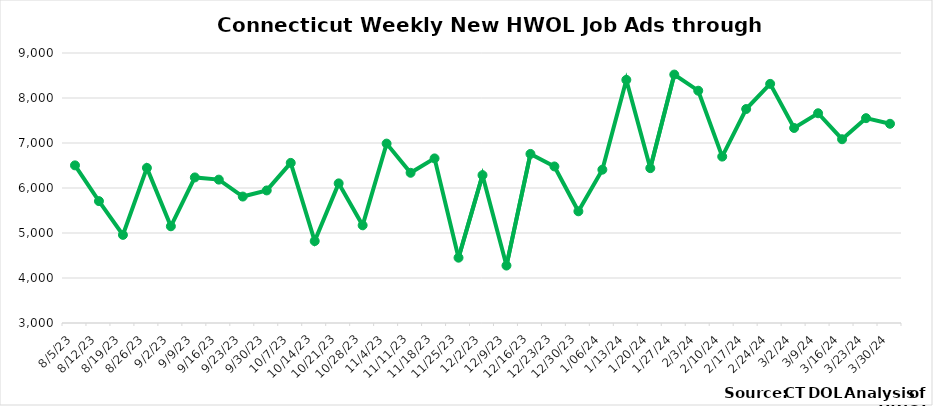
| Category | Connecticut |
|---|---|
| 8/5/23 | 6503 |
| 8/12/23 | 5708 |
| 8/19/23 | 4958 |
| 8/26/23 | 6447 |
| 9/2/23 | 5149 |
| 9/9/23 | 6235 |
| 9/16/23 | 6186 |
| 9/23/23 | 5810 |
| 9/30/23 | 5946 |
| 10/7/23 | 6558 |
| 10/14/23 | 4820 |
| 10/21/23 | 6103 |
| 10/28/23 | 5171 |
| 11/4/23 | 6987 |
| 11/11/23 | 6338 |
| 11/18/23 | 6658 |
| 11/25/23 | 4451 |
| 12/2/23 | 6286 |
| 12/9/23 | 4276 |
| 12/16/23 | 6757 |
|  12/23/23 | 6479 |
|  12/30/23 | 5482 |
|  1/06/24 | 6407 |
|  1/13/24 | 8403 |
|  1/20/24 | 6441 |
|  1/27/24 | 8521 |
|  2/3/24 | 8162 |
|  2/10/24 | 6698 |
|  2/17/24 | 7755 |
|  2/24/24 | 8314 |
|  3/2/24 | 7334 |
|  3/9/24 | 7661 |
|  3/16/24 | 7084 |
|  3/23/24 | 7552 |
|  3/30/24 | 7427 |